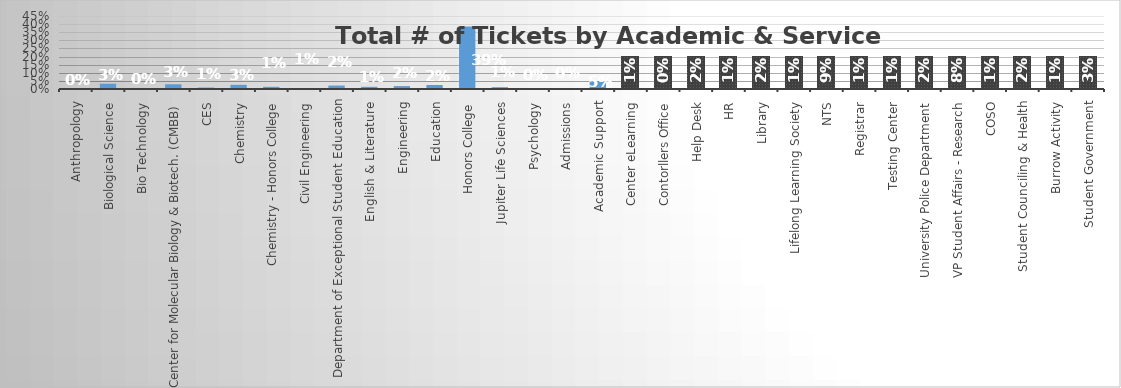
| Category | Series 0 |
|---|---|
| Anthropology | 0.002 |
| Biological Science | 0.032 |
| Bio Technology | 0.003 |
| Center for Molecular Biology & Biotech. (CMBB) | 0.029 |
| CES | 0.009 |
| Chemistry | 0.026 |
| Chemistry - Honors College | 0.013 |
| Civil Engineering | 0.006 |
| Department of Exceptional Student Education | 0.021 |
| English & Literature | 0.013 |
| Engineering | 0.018 |
| Education | 0.025 |
| Honors College | 0.386 |
| Jupiter Life Sciences | 0.011 |
| Psychology | 0.004 |
| Admissions | 0.004 |
| Academic Support | 0.049 |
| Center eLearning | 0.007 |
| Contorllers Office | 0.002 |
| Help Desk | 0.021 |
| HR | 0.009 |
| Library | 0.019 |
| Lifelong Learning Society | 0.011 |
| NTS | 0.089 |
| Registrar | 0.013 |
| Testing Center | 0.007 |
| University Police Department | 0.022 |
| VP Student Affairs - Research | 0.076 |
| COSO | 0.008 |
| Student Counciling & Health | 0.02 |
| Burrow Activity | 0.012 |
| Student Government | 0.029 |